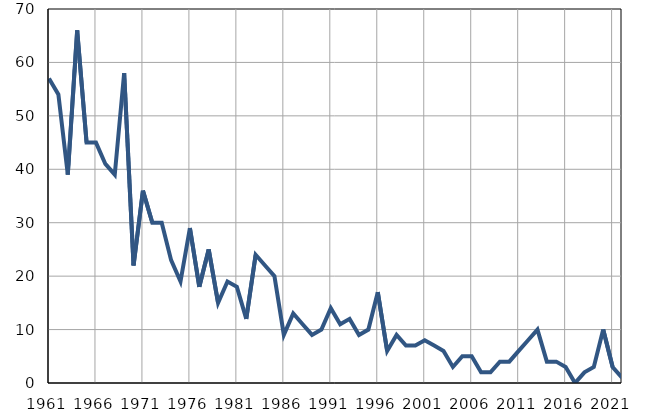
| Category | Умрла 
одојчад |
|---|---|
| 1961.0 | 57 |
| 1962.0 | 54 |
| 1963.0 | 39 |
| 1964.0 | 66 |
| 1965.0 | 45 |
| 1966.0 | 45 |
| 1967.0 | 41 |
| 1968.0 | 39 |
| 1969.0 | 58 |
| 1970.0 | 22 |
| 1971.0 | 36 |
| 1972.0 | 30 |
| 1973.0 | 30 |
| 1974.0 | 23 |
| 1975.0 | 19 |
| 1976.0 | 29 |
| 1977.0 | 18 |
| 1978.0 | 25 |
| 1979.0 | 15 |
| 1980.0 | 19 |
| 1981.0 | 18 |
| 1982.0 | 12 |
| 1983.0 | 24 |
| 1984.0 | 22 |
| 1985.0 | 20 |
| 1986.0 | 9 |
| 1987.0 | 13 |
| 1988.0 | 11 |
| 1989.0 | 9 |
| 1990.0 | 10 |
| 1991.0 | 14 |
| 1992.0 | 11 |
| 1993.0 | 12 |
| 1994.0 | 9 |
| 1995.0 | 10 |
| 1996.0 | 17 |
| 1997.0 | 6 |
| 1998.0 | 9 |
| 1999.0 | 7 |
| 2000.0 | 7 |
| 2001.0 | 8 |
| 2002.0 | 7 |
| 2003.0 | 6 |
| 2004.0 | 3 |
| 2005.0 | 5 |
| 2006.0 | 5 |
| 2007.0 | 2 |
| 2008.0 | 2 |
| 2009.0 | 4 |
| 2010.0 | 4 |
| 2011.0 | 6 |
| 2012.0 | 8 |
| 2013.0 | 10 |
| 2014.0 | 4 |
| 2015.0 | 4 |
| 2016.0 | 3 |
| 2017.0 | 0 |
| 2018.0 | 2 |
| 2019.0 | 3 |
| 2020.0 | 10 |
| 2021.0 | 3 |
| 2022.0 | 1 |